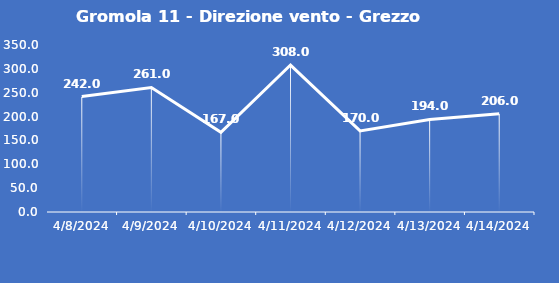
| Category | Gromola 11 - Direzione vento - Grezzo (°N) |
|---|---|
| 4/8/24 | 242 |
| 4/9/24 | 261 |
| 4/10/24 | 167 |
| 4/11/24 | 308 |
| 4/12/24 | 170 |
| 4/13/24 | 194 |
| 4/14/24 | 206 |